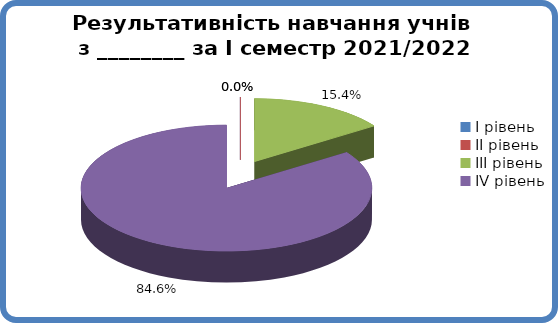
| Category | Series 0 |
|---|---|
| 0 | 0 |
| 1 | 0 |
| 2 | 0.154 |
| 3 | 0.846 |